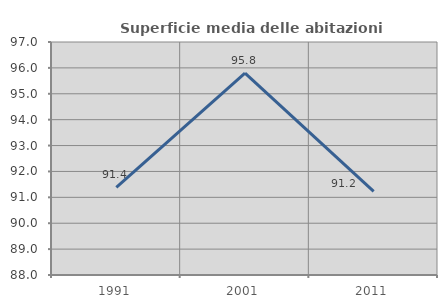
| Category | Superficie media delle abitazioni occupate |
|---|---|
| 1991.0 | 91.382 |
| 2001.0 | 95.8 |
| 2011.0 | 91.226 |